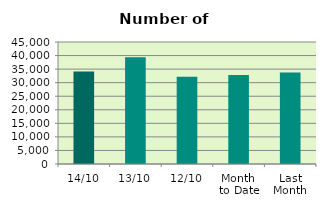
| Category | Series 0 |
|---|---|
| 14/10 | 34134 |
| 13/10 | 39364 |
| 12/10 | 32138 |
| Month 
to Date | 32853.6 |
| Last
Month | 33733.273 |